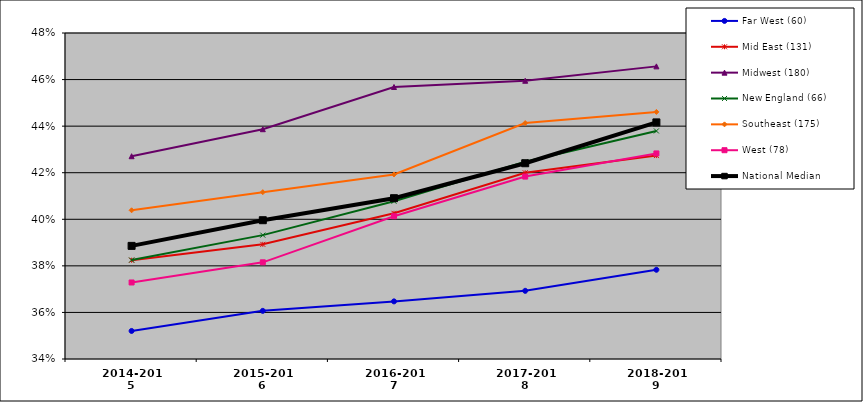
| Category | Far West (60) | Mid East (131) | Midwest (180) | New England (66) | Southeast (175) | West (78) | National Median |
|---|---|---|---|---|---|---|---|
| 2014-2015 | 0.352 | 0.382 | 0.427 | 0.382 | 0.404 | 0.373 | 0.389 |
| 2015-2016 | 0.361 | 0.389 | 0.439 | 0.393 | 0.412 | 0.382 | 0.4 |
| 2016-2017 | 0.365 | 0.403 | 0.457 | 0.408 | 0.419 | 0.401 | 0.409 |
| 2017-2018 | 0.369 | 0.42 | 0.459 | 0.425 | 0.441 | 0.418 | 0.424 |
| 2018-2019 | 0.378 | 0.427 | 0.466 | 0.438 | 0.446 | 0.428 | 0.442 |